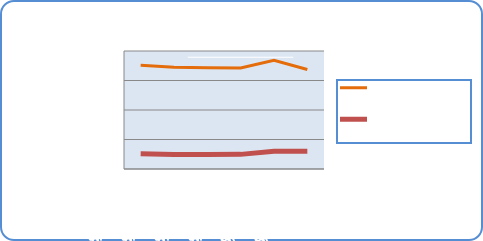
| Category | Motorin Türleri  | Benzin Türleri |
|---|---|---|
| 8/6/18 | 70389472.419 | 10296648.448 |
| 8/7/18 | 68928281.857 | 9789047.804 |
| 8/8/18 | 68611120.543 | 9868590.854 |
| 8/9/18 | 68493586.801 | 9919695.219 |
| 8/10/18 | 73633327.074 | 11992844.932 |
| 8/11/18 | 67428082.133 | 12056375.242 |